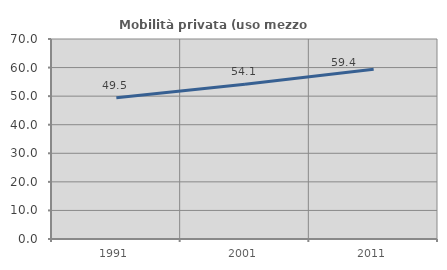
| Category | Mobilità privata (uso mezzo privato) |
|---|---|
| 1991.0 | 49.459 |
| 2001.0 | 54.127 |
| 2011.0 | 59.45 |